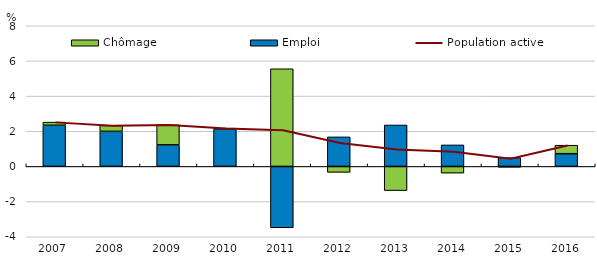
| Category | Emploi | Chômage |
|---|---|---|
| 2007.0 | 2.34 | 0.179 |
| 2008.0 | 1.994 | 0.333 |
| 2009.0 | 1.225 | 1.139 |
| 2010.0 | 2.122 | 0.053 |
| 2011.0 | -3.49 | 5.554 |
| 2012.0 | 1.68 | -0.336 |
| 2013.0 | 2.357 | -1.374 |
| 2014.0 | 1.223 | -0.381 |
| 2015.0 | 0.497 | -0.047 |
| 2016.0 | 0.723 | 0.483 |